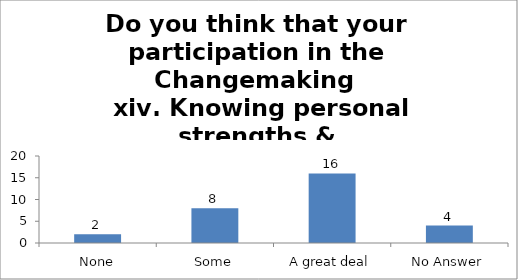
| Category | Do you think that your participation in the Changemaking 
 xiv. Knowing personal strengths & weaknesses.   |
|---|---|
| None | 2 |
| Some | 8 |
| A great deal | 16 |
| No Answer | 4 |